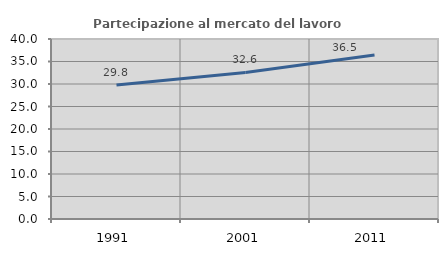
| Category | Partecipazione al mercato del lavoro  femminile |
|---|---|
| 1991.0 | 29.775 |
| 2001.0 | 32.579 |
| 2011.0 | 36.457 |